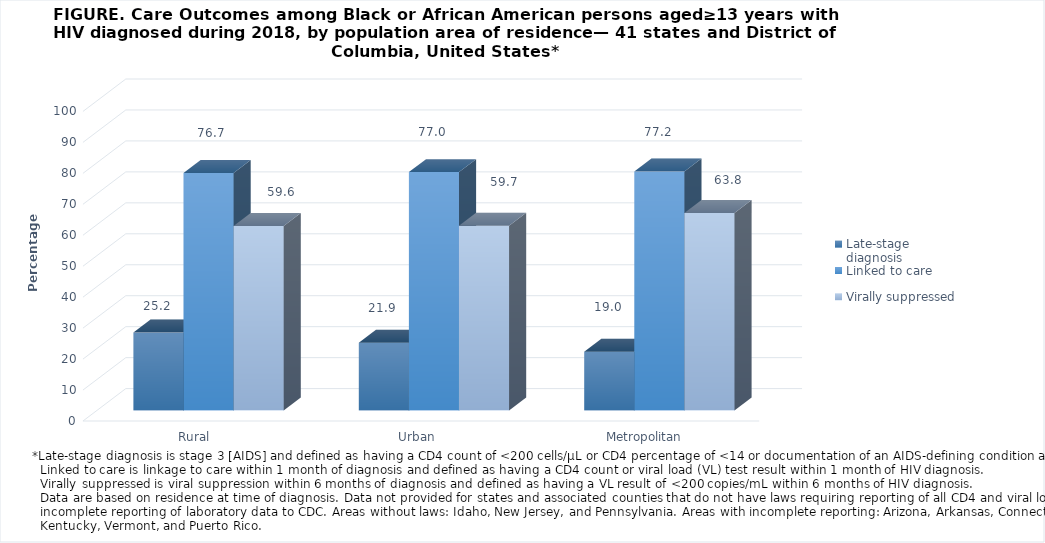
| Category | Late-stage diagnosis  | Linked to care  | Virally suppressed  |
|---|---|---|---|
| Rural | 25.2 | 76.7 | 59.6 |
| Urban  | 21.9 | 77 | 59.7 |
| Metropolitan | 19 | 77.2 | 63.8 |